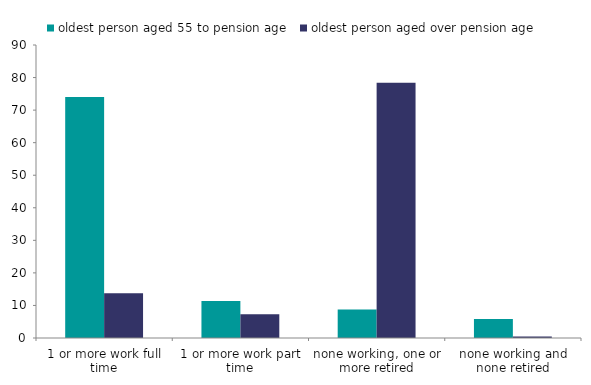
| Category | oldest person aged 55 to pension age | oldest person aged over pension age |
|---|---|---|
| 1 or more work full time | 74.044 | 13.76 |
| 1 or more work part time | 11.375 | 7.317 |
| none working, one or more retired | 8.743 | 78.433 |
| none working and none retired | 5.838 | 0.49 |